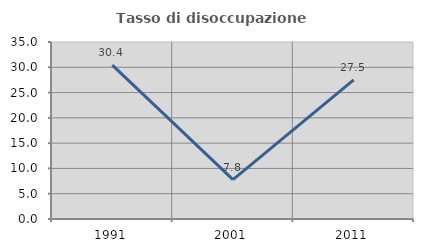
| Category | Tasso di disoccupazione giovanile  |
|---|---|
| 1991.0 | 30.435 |
| 2001.0 | 7.792 |
| 2011.0 | 27.5 |